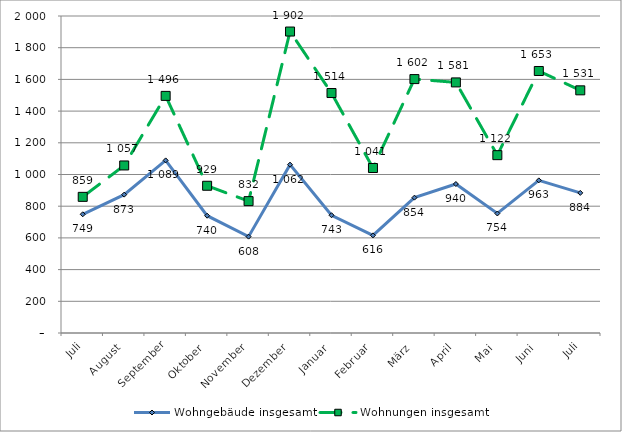
| Category | Wohngebäude insgesamt | Wohnungen insgesamt |
|---|---|---|
| Juli | 749 | 859 |
| August | 873 | 1057 |
| September | 1089 | 1496 |
| Oktober | 740 | 929 |
| November | 608 | 832 |
| Dezember | 1062 | 1902 |
| Januar | 743 | 1514 |
| Februar | 616 | 1041 |
| März | 854 | 1602 |
| April | 940 | 1581 |
| Mai | 754 | 1122 |
| Juni | 963 | 1653 |
| Juli | 884 | 1531 |